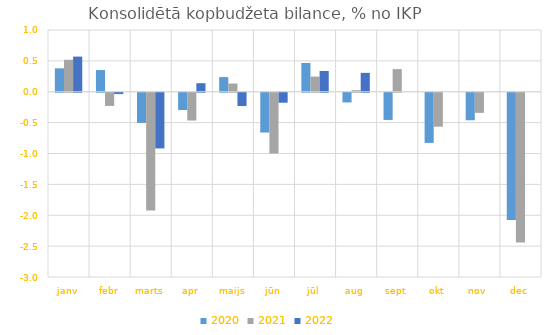
| Category | 2020 | 2021 | 2022 |
|---|---|---|---|
| janv | 0.379 | 0.518 | 0.569 |
| febr | 0.351 | -0.213 | -0.021 |
| marts | -0.489 | -1.906 | -0.902 |
| apr | -0.28 | -0.45 | 0.139 |
| maijs | 0.237 | 0.133 | -0.215 |
| jūn | -0.644 | -0.984 | -0.162 |
| jūl | 0.466 | 0.245 | 0.336 |
| aug | -0.157 | 0.025 | 0.306 |
| sept | -0.44 | 0.367 | 0 |
| okt | -0.813 | -0.549 | 0 |
| nov | -0.445 | -0.326 | 0 |
| dec | -2.059 | -2.423 | 0 |